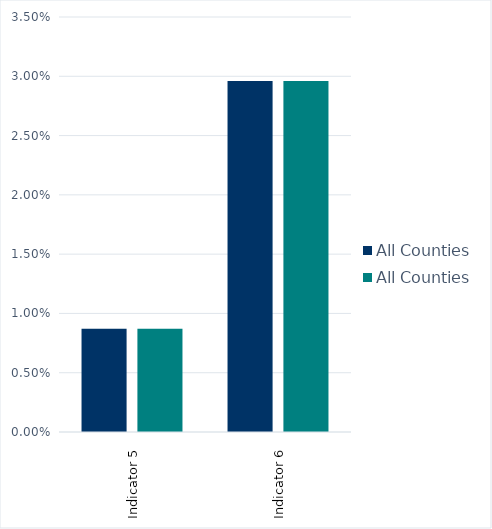
| Category | All Counties |
|---|---|
| Indicator 5 | 0.009 |
| Indicator 6 | 0.03 |